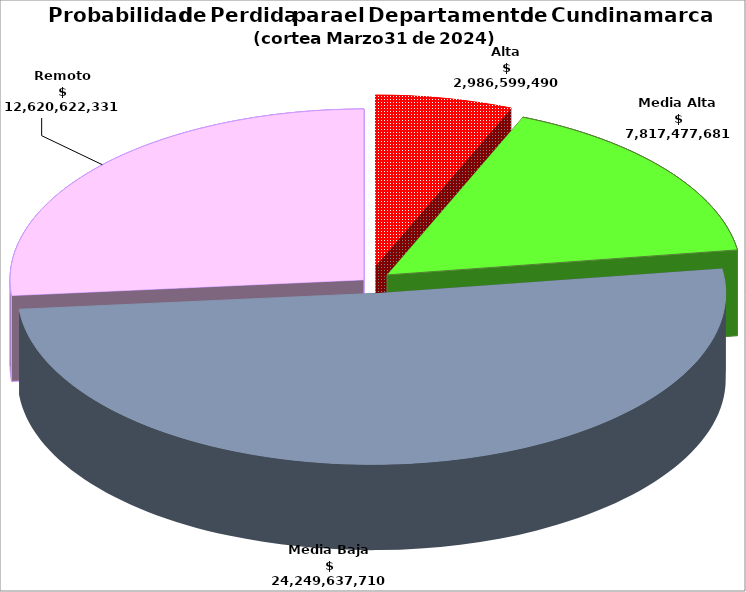
| Category | Series 0 |
|---|---|
| Alta | 2986599489.889 |
| Media Alta | 7817477681.128 |
| Media Baja | 24249637710.48 |
| Remoto | 12620622330.82 |